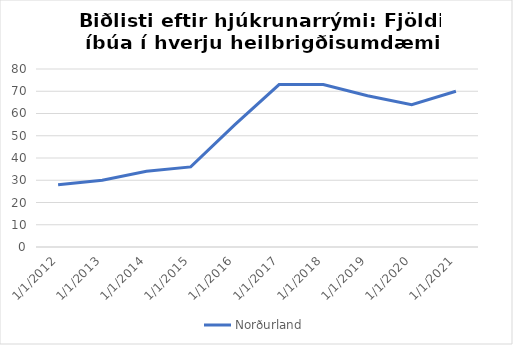
| Category | Norðurland |
|---|---|
| 1/1/12 | 28 |
| 1/1/13 | 30 |
| 1/1/14 | 34 |
| 1/1/15 | 36 |
| 1/1/16 | 55 |
| 1/1/17 | 73 |
| 1/1/18 | 73 |
| 1/1/19 | 68 |
| 1/1/20 | 64 |
| 1/1/21 | 70 |